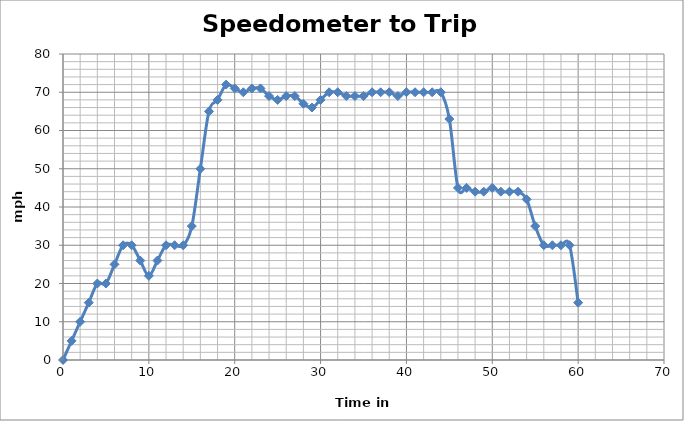
| Category | mph |
|---|---|
| 0.0 | 0 |
| 1.0 | 5 |
| 2.0 | 10 |
| 3.0 | 15 |
| 4.0 | 20 |
| 5.0 | 20 |
| 6.0 | 25 |
| 7.0 | 30 |
| 8.0 | 30 |
| 9.0 | 26 |
| 10.0 | 22 |
| 11.0 | 26 |
| 12.0 | 30 |
| 13.0 | 30 |
| 14.0 | 30 |
| 15.0 | 35 |
| 16.0 | 50 |
| 17.0 | 65 |
| 18.0 | 68 |
| 19.0 | 72 |
| 20.0 | 71 |
| 21.0 | 70 |
| 22.0 | 71 |
| 23.0 | 71 |
| 24.0 | 69 |
| 25.0 | 68 |
| 26.0 | 69 |
| 27.0 | 69 |
| 28.0 | 67 |
| 29.0 | 66 |
| 30.0 | 68 |
| 31.0 | 70 |
| 32.0 | 70 |
| 33.0 | 69 |
| 34.0 | 69 |
| 35.0 | 69 |
| 36.0 | 70 |
| 37.0 | 70 |
| 38.0 | 70 |
| 39.0 | 69 |
| 40.0 | 70 |
| 41.0 | 70 |
| 42.0 | 70 |
| 43.0 | 70 |
| 44.0 | 70 |
| 45.0 | 63 |
| 46.0 | 45 |
| 47.0 | 45 |
| 48.0 | 44 |
| 49.0 | 44 |
| 50.0 | 45 |
| 51.0 | 44 |
| 52.0 | 44 |
| 53.0 | 44 |
| 54.0 | 42 |
| 55.0 | 35 |
| 56.0 | 30 |
| 57.0 | 30 |
| 58.0 | 30 |
| 59.0 | 30 |
| 60.0 | 15 |